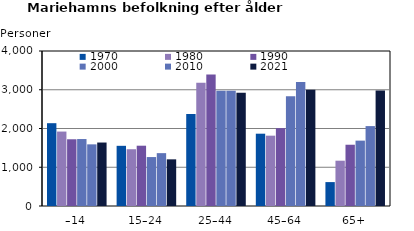
| Category | 1970 | 1980 | 1990 | 2000 | 2010 | 2021 |
|---|---|---|---|---|---|---|
| –14 | 2137 | 1921 | 1722 | 1728 | 1591 | 1638 |
| 15–24 | 1553 | 1465 | 1556 | 1263 | 1364 | 1204 |
| 25–44 | 2373 | 3183 | 3395 | 2977 | 2975 | 2920 |
| 45–64 | 1866 | 1815 | 2009 | 2833 | 3198 | 3001 |
| 65+ | 617 | 1169 | 1581 | 1687 | 2062 | 2979 |